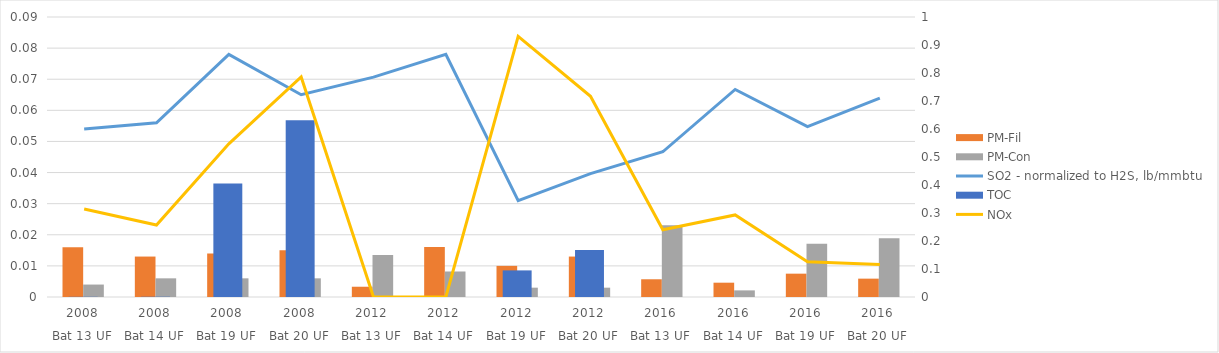
| Category | PM-Fil | PM-Con |
|---|---|---|
| 0 | 0.016 | 0.004 |
| 1 | 0.013 | 0.006 |
| 2 | 0.014 | 0.006 |
| 3 | 0.015 | 0.006 |
| 4 | 0.003 | 0.014 |
| 5 | 0.016 | 0.008 |
| 6 | 0.01 | 0.003 |
| 7 | 0.013 | 0.003 |
| 8 | 0.006 | 0.023 |
| 9 | 0.005 | 0.002 |
| 10 | 0.008 | 0.017 |
| 11 | 0.006 | 0.019 |